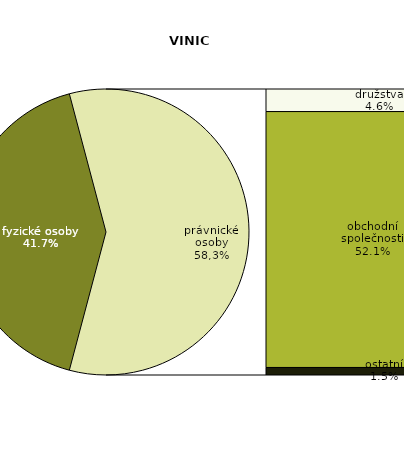
| Category | ha |
|---|---|
| fyzické osoby  | 7555.562 |
| družstva | 832.114 |
| obchodní společnosti | 9434.084 |
| ostatní | 277.605 |